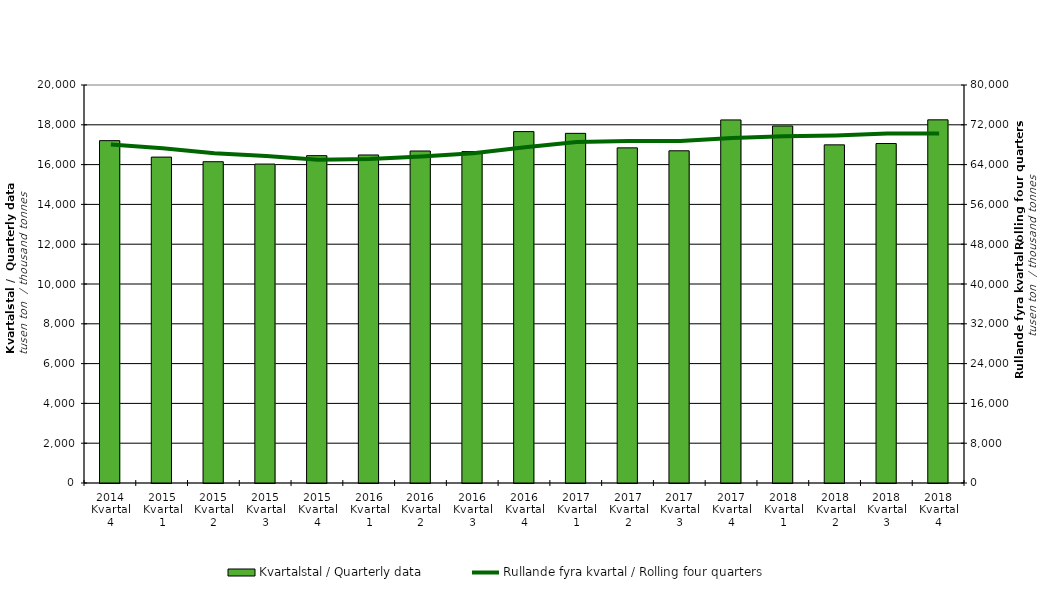
| Category | Kvartalstal / Quarterly data |
|---|---|
| 2014 Kvartal 4 | 17203.242 |
| 2015 Kvartal 1 | 16376.707 |
| 2015 Kvartal 2 | 16145.019 |
| 2015 Kvartal 3 | 16026.933 |
| 2015 Kvartal 4 | 16449.975 |
| 2016 Kvartal 1 | 16483.647 |
| 2016 Kvartal 2 | 16682.729 |
| 2016 Kvartal 3 | 16654.381 |
| 2016 Kvartal 4 | 17657.952 |
| 2017 Kvartal 1 | 17570.534 |
| 2017 Kvartal 2 | 16840.891 |
| 2017 Kvartal 3 | 16693.737 |
| 2017 Kvartal 4 | 18245.096 |
| 2018 Kvartal 1 | 17940.024 |
| 2018 Kvartal 2 | 16992.215 |
| 2018 Kvartal 3 | 17059.595 |
| 2018 Kvartal 4 | 18249.81 |